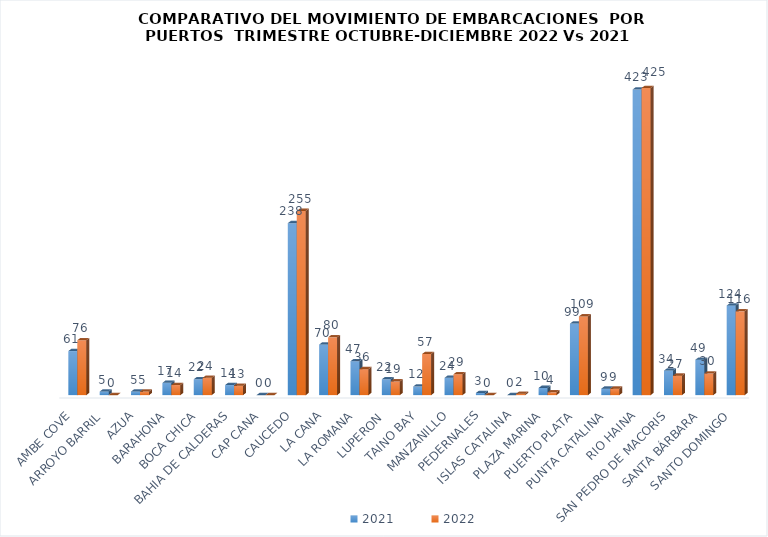
| Category | 2021 | 2022 |
|---|---|---|
| AMBE COVE | 61 | 76 |
| ARROYO BARRIL | 5 | 0 |
| AZUA | 5 | 5 |
| BARAHONA | 17 | 14 |
| BOCA CHICA | 22 | 24 |
| BAHIA DE CALDERAS | 14 | 13 |
| CAP CANA | 0 | 0 |
| CAUCEDO | 238 | 255 |
| LA CANA | 70 | 80 |
| LA ROMANA | 47 | 36 |
| LUPERON  | 22 | 19 |
| TAINO BAY | 12 | 57 |
| MANZANILLO | 24 | 29 |
| PEDERNALES | 3 | 0 |
| ISLAS CATALINA | 0 | 2 |
| PLAZA MARINA | 10 | 4 |
| PUERTO PLATA | 99 | 109 |
| PUNTA CATALINA | 9 | 9 |
| RIO HAINA | 423 | 425 |
| SAN PEDRO DE MACORIS | 34 | 27 |
| SANTA BÁRBARA | 49 | 30 |
| SANTO DOMINGO | 124 | 116 |